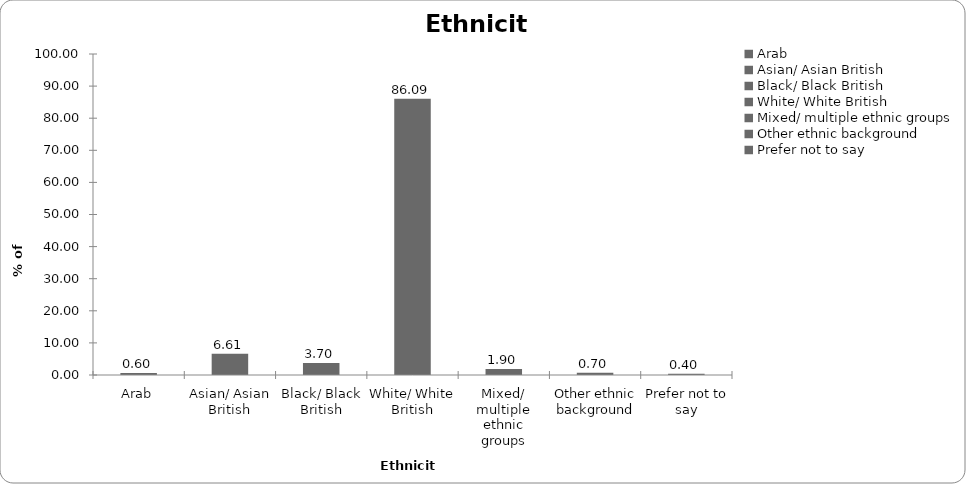
| Category | Ethnicity |
|---|---|
| Arab | 0.601 |
| Asian/ Asian British | 6.607 |
| Black/ Black British | 3.704 |
| White/ White British | 86.086 |
| Mixed/ multiple ethnic groups | 1.902 |
| Other ethnic background | 0.701 |
| Prefer not to say | 0.4 |